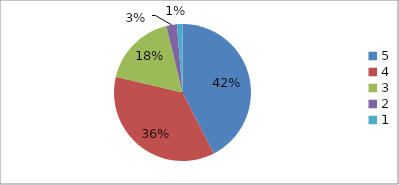
| Category | Series 0 | Series 1 |
|---|---|---|
| 5.0 | 42.5 | 42.5 |
| 4.0 | 36.3 | 36.3 |
| 3.0 | 17.5 | 17.5 |
| 2.0 | 2.5 | 2.5 |
| 1.0 | 1.3 | 1.3 |